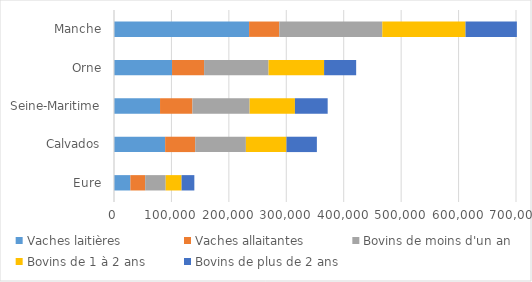
| Category | Vaches laitières | Vaches allaitantes | Bovins de moins d'un an | Bovins de 1 à 2 ans | Bovins de plus de 2 ans |
|---|---|---|---|---|---|
| Eure | 28517 | 25756 | 35752 | 27612 | 22261 |
| Calvados | 89054 | 52313 | 88299 | 70683 | 52909 |
| Seine-Maritime | 80160 | 56440 | 99589 | 78862 | 57026 |
| Orne | 101058 | 55814 | 112244 | 96721 | 55834 |
| Manche | 235236 | 52572 | 179381 | 144893 | 89402 |